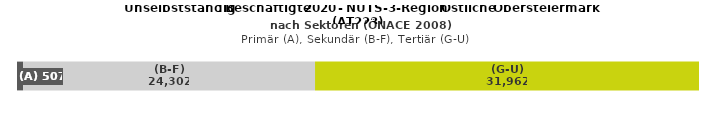
| Category | (A) | (B-F) | (G-U) |
|---|---|---|---|
| 0 | 507 | 24302 | 31962 |